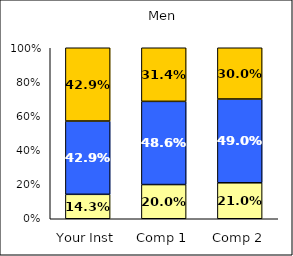
| Category | Low Faculty Interaction | Average Faculty Interaction | High Faculty Interaction |
|---|---|---|---|
| Your Inst | 0.143 | 0.429 | 0.429 |
| Comp 1 | 0.2 | 0.486 | 0.314 |
| Comp 2 | 0.21 | 0.49 | 0.3 |